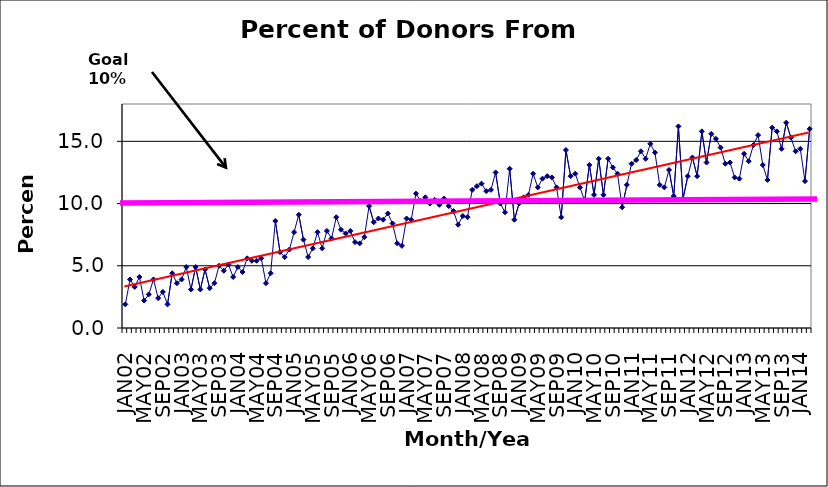
| Category | Series 0 |
|---|---|
| JAN02 | 1.9 |
| FEB02 | 3.9 |
| MAR02 | 3.3 |
| APR02 | 4.1 |
| MAY02 | 2.2 |
| JUN02 | 2.7 |
| JUL02 | 3.9 |
| AUG02 | 2.4 |
| SEP02 | 2.9 |
| OCT02 | 1.9 |
| NOV02 | 4.4 |
| DEC02 | 3.6 |
| JAN03 | 3.9 |
| FEB03 | 4.9 |
| MAR03 | 3.1 |
| APR03 | 4.9 |
| MAY03 | 3.1 |
| JUN03 | 4.7 |
| JUL03 | 3.2 |
| AUG03 | 3.6 |
| SEP03 | 5 |
| OCT03 | 4.6 |
| NOV03 | 5.1 |
| DEC03 | 4.1 |
| JAN04 | 4.9 |
| FEB04 | 4.5 |
| MAR04 | 5.6 |
| APR04 | 5.4 |
| MAY04 | 5.4 |
| JUN04 | 5.6 |
| JUL04 | 3.6 |
| AUG04 | 4.4 |
| SEP04 | 8.6 |
| OCT04 | 6.1 |
| NOV04 | 5.7 |
| DEC04 | 6.3 |
| JAN05 | 7.7 |
| FEB05 | 9.1 |
| MAR05 | 7.1 |
| APR05 | 5.7 |
| MAY05 | 6.4 |
| JUN05 | 7.7 |
| JUL05 | 6.4 |
| AUG05 | 7.8 |
| SEP05 | 7.2 |
| OCT05 | 8.9 |
| NOV05 | 7.9 |
| DEC05 | 7.6 |
| JAN06 | 7.8 |
| FEB06 | 6.9 |
| MAR06 | 6.8 |
| APR06 | 7.3 |
| MAY06 | 9.8 |
| JUN06 | 8.5 |
| JUL06 | 8.8 |
| AUG06 | 8.7 |
| SEP06 | 9.2 |
| OCT06 | 8.4 |
| NOV06 | 6.8 |
| DEC06 | 6.6 |
| JAN07 | 8.8 |
| FEB07 | 8.7 |
| MAR07 | 10.8 |
| APR07 | 10.2 |
| MAY07 | 10.5 |
| JUN07 | 10 |
| JUL07 | 10.3 |
| AUG07 | 9.9 |
| SEP07 | 10.4 |
| OCT07 | 9.8 |
| NOV07 | 9.4 |
| DEC07 | 8.3 |
| JAN08 | 9 |
| FEB08 | 8.9 |
| MAR08 | 11.1 |
| APR08 | 11.4 |
| MAY08 | 11.6 |
| JUN08 | 11 |
| JUL08 | 11.1 |
| AUG08 | 12.5 |
| SEP08 | 10 |
| OCT08 | 9.3 |
| NOV08 | 12.8 |
| DEC08 | 8.7 |
| JAN09 | 10 |
| FEB09 | 10.5 |
| MAR09 | 10.7 |
| APR09 | 12.4 |
| MAY09 | 11.3 |
| JUN09 | 12 |
| JUL09 | 12.2 |
| AUG09 | 12.1 |
| SEP09 | 11.3 |
| OCT09 | 8.9 |
| NOV09 | 14.3 |
| DEC09 | 12.2 |
| JAN10 | 12.4 |
| FEB10 | 11.3 |
| MAR10 | 10.2 |
| APR10 | 13.1 |
| MAY10 | 10.7 |
| JUN10 | 13.6 |
| JUL10 | 10.7 |
| AUG10 | 13.6 |
| SEP10 | 12.9 |
| OCT10 | 12.4 |
| NOV10 | 9.7 |
| DEC10 | 11.5 |
| JAN11 | 13.2 |
| FEB11 | 13.5 |
| MAR11 | 14.2 |
| APR11 | 13.6 |
| MAY11 | 14.8 |
| JUN11 | 14.1 |
| JUL11 | 11.5 |
| AUG11 | 11.3 |
| SEP11 | 12.7 |
| OCT11 | 10.6 |
| NOV11 | 16.2 |
| DEC11 | 10.4 |
| JAN12 | 12.2 |
| FEB12 | 13.7 |
| MAR12 | 12.2 |
| APR12 | 15.8 |
| MAY12 | 13.3 |
| JUN12 | 15.6 |
| JUL12 | 15.2 |
| AUG12 | 14.5 |
| SEP12 | 13.2 |
| OCT12 | 13.3 |
| NOV12 | 12.1 |
| DEC12 | 12 |
| JAN13 | 14 |
| FEB13 | 13.4 |
| MAR13 | 14.7 |
| APR13 | 15.5 |
| MAY13 | 13.1 |
| JUN13 | 11.9 |
| JUL13 | 16.1 |
| AUG13 | 15.8 |
| SEP13 | 14.4 |
| OCT13 | 16.5 |
| NOV13 | 15.3 |
| DEC13 | 14.2 |
| JAN14 | 14.4 |
| FEB14 | 11.8 |
| MAR14 | 16 |